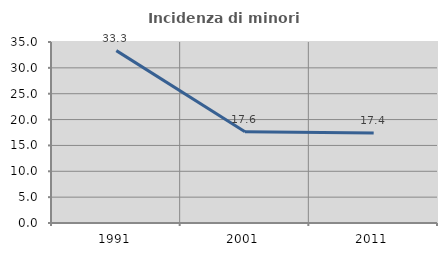
| Category | Incidenza di minori stranieri |
|---|---|
| 1991.0 | 33.333 |
| 2001.0 | 17.647 |
| 2011.0 | 17.391 |